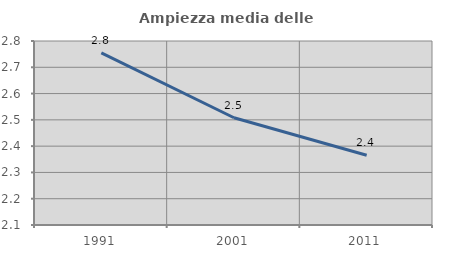
| Category | Ampiezza media delle famiglie |
|---|---|
| 1991.0 | 2.755 |
| 2001.0 | 2.508 |
| 2011.0 | 2.365 |